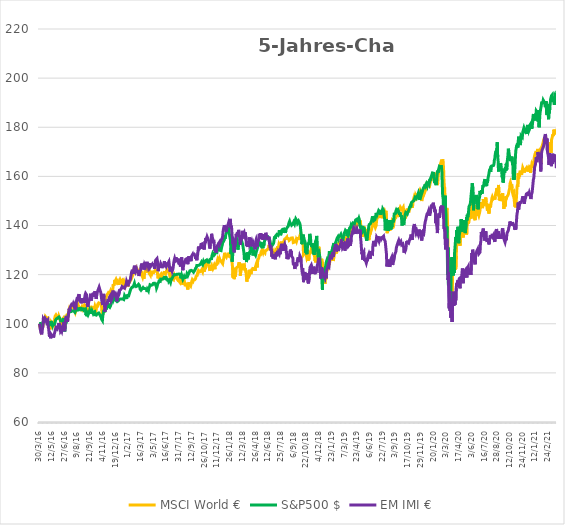
| Category | MSCI World € | S&P500 $ | EM IMI € |
|---|---|---|---|
| 2016-03-30 | 100 | 100 | 100 |
| 2016-03-31 | 99.311 | 99.762 | 99.573 |
| 2016-04-01 | 98.621 | 100.402 | 98.345 |
| 2016-04-04 | 98.814 | 100.085 | 98.345 |
| 2016-04-05 | 97.353 | 99.069 | 96.476 |
| 2016-04-06 | 97.932 | 100.148 | 96.369 |
| 2016-04-07 | 97.601 | 98.968 | 95.675 |
| 2016-04-08 | 98.153 | 99.238 | 97.01 |
| 2016-04-11 | 98.18 | 98.979 | 98.025 |
| 2016-04-12 | 98.952 | 99.942 | 98.879 |
| 2016-04-13 | 100.8 | 100.942 | 101.922 |
| 2016-04-14 | 101.958 | 100.931 | 102.029 |
| 2016-04-15 | 101.379 | 100.82 | 101.335 |
| 2016-04-18 | 101.544 | 101.55 | 101.281 |
| 2016-04-19 | 102.233 | 101.857 | 102.296 |
| 2016-04-20 | 102.923 | 101.942 | 101.975 |
| 2016-04-21 | 102.84 | 101.376 | 101.815 |
| 2016-04-22 | 102.812 | 101.402 | 101.548 |
| 2016-04-25 | 102.233 | 101.238 | 100.587 |
| 2016-04-26 | 102.261 | 101.386 | 100.641 |
| 2016-04-27 | 102.316 | 101.598 | 100.801 |
| 2016-04-28 | 102.399 | 100.683 | 101.335 |
| 2016-04-29 | 99.393 | 100.111 | 98.505 |
| 2016-05-02 | 99.724 | 100.91 | 98.025 |
| 2016-05-03 | 98.594 | 100.048 | 96.103 |
| 2016-05-04 | 98.098 | 99.46 | 94.768 |
| 2016-05-05 | 99.118 | 99.45 | 95.675 |
| 2016-05-06 | 97.767 | 99.81 | 94.981 |
| 2016-05-09 | 98.897 | 99.915 | 94.074 |
| 2016-05-10 | 100.193 | 101.153 | 95.675 |
| 2016-05-11 | 99.807 | 100.206 | 95.622 |
| 2016-05-12 | 99.393 | 100.265 | 95.195 |
| 2016-05-13 | 100.248 | 99.339 | 95.248 |
| 2016-05-17 | 100.386 | 100.328 | 95.035 |
| 2016-05-18 | 100.441 | 99.444 | 95.248 |
| 2016-05-19 | 99.504 | 99.429 | 94.394 |
| 2016-05-20 | 100.993 | 99.106 | 95.355 |
| 2016-05-23 | 100.524 | 99.725 | 95.195 |
| 2016-05-24 | 102.288 | 99.593 | 96.53 |
| 2016-05-25 | 103.171 | 100.857 | 97.277 |
| 2016-05-26 | 103.06 | 101.545 | 97.651 |
| 2016-05-27 | 103.667 | 101.593 | 98.398 |
| 2016-05-30 | 103.915 | 101.989 | 98.131 |
| 2016-05-31 | 103.557 | 101.868 | 98.078 |
| 2016-06-01 | 102.923 | 102.058 | 97.864 |
| 2016-06-02 | 103.06 | 102.365 | 98.452 |
| 2016-06-03 | 101.627 | 102.069 | 97.971 |
| 2016-06-06 | 102.288 | 102.561 | 99.359 |
| 2016-06-07 | 103.088 | 102.746 | 100.32 |
| 2016-06-08 | 102.647 | 103.084 | 100.374 |
| 2016-06-09 | 102.564 | 102.926 | 99.947 |
| 2016-06-10 | 101.765 | 101.936 | 98.452 |
| 2016-06-13 | 100.662 | 101.169 | 96.957 |
| 2016-06-14 | 99.917 | 100.947 | 96.583 |
| 2016-06-15 | 100.248 | 100.799 | 97.491 |
| 2016-06-16 | 100.138 | 101.127 | 97.064 |
| 2016-06-17 | 99.862 | 100.751 | 97.117 |
| 2016-06-20 | 101.792 | 101.397 | 98.986 |
| 2016-06-21 | 101.93 | 101.18 | 99.466 |
| 2016-06-22 | 102.261 | 101.011 | 100.107 |
| 2016-06-23 | 102.564 | 102.317 | 100.587 |
| 2016-06-24 | 100.496 | 98.704 | 98.292 |
| 2016-06-27 | 98.373 | 96.847 | 96.957 |
| 2016-06-28 | 99.063 | 98.635 | 99.092 |
| 2016-06-29 | 101.434 | 100.333 | 101.708 |
| 2016-06-30 | 102.399 | 101.688 | 102.349 |
| 2016-07-01 | 102.867 | 101.899 | 103.15 |
| 2016-07-04 | 102.895 | 101.185 | 102.883 |
| 2016-07-05 | 102.095 | 101.783 | 101.442 |
| 2016-07-06 | 101.875 | 101.714 | 100.801 |
| 2016-07-07 | 102.702 | 103.259 | 102.029 |
| 2016-07-08 | 102.812 | 103.619 | 103.257 |
| 2016-07-11 | 105.156 | 104.349 | 104.805 |
| 2016-07-12 | 105.817 | 104.312 | 106.14 |
| 2016-07-13 | 105.266 | 104.92 | 104.912 |
| 2016-07-14 | 106.093 | 104.762 | 106.46 |
| 2016-07-15 | 105.542 | 105.063 | 106.887 |
| 2016-07-18 | 106.341 | 104.947 | 107.048 |
| 2016-07-19 | 106.424 | 105.37 | 107.048 |
| 2016-07-20 | 107.306 | 104.973 | 107.902 |
| 2016-07-21 | 107.058 | 105.46 | 107.581 |
| 2016-07-22 | 107.224 | 105.206 | 107.742 |
| 2016-07-25 | 107.058 | 105.201 | 107.528 |
| 2016-07-26 | 107.113 | 105.132 | 108.062 |
| 2016-07-27 | 107.251 | 105.248 | 108.062 |
| 2016-07-28 | 106.038 | 105.434 | 107.048 |
| 2016-07-29 | 106.396 | 105.312 | 107.475 |
| 2016-08-01 | 106.203 | 104.656 | 107.742 |
| 2016-08-02 | 104.604 | 104.957 | 105.82 |
| 2016-08-03 | 105.128 | 105.058 | 106.193 |
| 2016-08-04 | 105.983 | 105.904 | 107.742 |
| 2016-08-05 | 107.224 | 105.852 | 109.343 |
| 2016-08-08 | 107.389 | 105.92 | 110.144 |
| 2016-08-09 | 107.637 | 105.65 | 110.785 |
| 2016-08-10 | 106.782 | 106.169 | 109.557 |
| 2016-08-11 | 107.554 | 106.063 | 111.052 |
| 2016-08-12 | 107.389 | 106.37 | 110.892 |
| 2016-08-15 | 107.527 | 105.82 | 112.066 |
| 2016-08-16 | 106.259 | 105.994 | 110.304 |
| 2016-08-17 | 105.79 | 106.248 | 109.076 |
| 2016-08-18 | 106.066 | 106.1 | 110.144 |
| 2016-08-19 | 105.762 | 106.09 | 109.237 |
| 2016-08-22 | 105.707 | 106.285 | 108.329 |
| 2016-08-23 | 106.369 | 105.772 | 109.183 |
| 2016-08-24 | 106.782 | 105.688 | 108.596 |
| 2016-08-25 | 106.231 | 105.486 | 108.436 |
| 2016-08-26 | 106.672 | 106.021 | 110.358 |
| 2016-08-29 | 106.948 | 105.82 | 109.237 |
| 2016-08-30 | 107.058 | 105.561 | 109.824 |
| 2016-08-31 | 106.617 | 105.539 | 108.97 |
| 2016-09-01 | 107.224 | 106.01 | 108.489 |
| 2016-09-02 | 106.617 | 106.344 | 110.678 |
| 2016-09-05 | 107.885 | 106.338 | 111.906 |
| 2016-09-06 | 107.334 | 106.09 | 112.387 |
| 2016-09-07 | 107.499 | 103.529 | 112.066 |
| 2016-09-08 | 107.168 | 105.01 | 111.906 |
| 2016-09-09 | 106.231 | 103.053 | 109.717 |
| 2016-09-12 | 105.211 | 102.989 | 107.902 |
| 2016-09-13 | 104.163 | 104.047 | 106.834 |
| 2016-09-14 | 104.218 | 103.64 | 106.887 |
| 2016-09-15 | 105.045 | 103.672 | 108.489 |
| 2016-09-16 | 105.018 | 103.682 | 108.169 |
| 2016-09-19 | 105.845 | 104.846 | 109.717 |
| 2016-09-20 | 105.707 | 105.476 | 109.61 |
| 2016-09-21 | 106.589 | 104.91 | 110.945 |
| 2016-09-22 | 107.279 | 104.074 | 112.226 |
| 2016-09-23 | 107.058 | 104.709 | 112.013 |
| 2016-09-26 | 105.459 | 105.275 | 109.45 |
| 2016-09-27 | 106.286 | 104.285 | 110.518 |
| 2016-09-28 | 106.396 | 105.121 | 111.212 |
| 2016-09-29 | 106.589 | 104.788 | 110.998 |
| 2016-09-30 | 106.341 | 104.301 | 110.945 |
| 2016-10-04 | 107.251 | 104.735 | 112.6 |
| 2016-10-05 | 106.727 | 104.857 | 111.052 |
| 2016-10-06 | 106.534 | 104.471 | 111.959 |
| 2016-10-07 | 106.286 | 104.952 | 111.959 |
| 2016-10-10 | 107.141 | 103.677 | 113.241 |
| 2016-10-11 | 106.672 | 103.809 | 111.372 |
| 2016-10-12 | 106.948 | 103.476 | 111.799 |
| 2016-10-13 | 105.983 | 103.502 | 110.091 |
| 2016-10-14 | 107.141 | 103.196 | 111.479 |
| 2016-10-17 | 106.645 | 103.804 | 111.265 |
| 2016-10-18 | 107.554 | 104.09 | 113.081 |
| 2016-10-19 | 108.051 | 103.92 | 113.241 |
| 2016-10-20 | 108.051 | 103.947 | 113.988 |
| 2016-10-21 | 108.492 | 104.37 | 114.362 |
| 2016-10-24 | 108.85 | 104.074 | 114.896 |
| 2016-10-25 | 108.575 | 103.841 | 115.216 |
| 2016-10-26 | 108.271 | 103.566 | 113.721 |
| 2016-10-27 | 108.133 | 103.238 | 113.187 |
| 2016-10-28 | 107.83 | 103.238 | 112.76 |
| 2016-10-31 | 107.279 | 102.518 | 112.707 |
| 2016-11-01 | 106.782 | 101.841 | 112.493 |
| 2016-11-02 | 104.522 | 101.444 | 108.809 |
| 2016-11-03 | 104.411 | 101.307 | 108.809 |
| 2016-11-04 | 103.998 | 103.529 | 107.635 |
| 2016-11-07 | 105.321 | 104.005 | 111.265 |
| 2016-11-08 | 106.369 | 105.116 | 112.173 |
| 2016-11-09 | 104.659 | 105.36 | 110.678 |
| 2016-11-10 | 108.519 | 105.164 | 107.955 |
| 2016-11-11 | 108.575 | 105.18 | 104.859 |
| 2016-11-14 | 109.733 | 106.031 | 105.873 |
| 2016-11-15 | 110.063 | 105.852 | 107.314 |
| 2016-11-16 | 110.67 | 106.354 | 107.314 |
| 2016-11-17 | 111.277 | 106.164 | 108.542 |
| 2016-11-18 | 111.414 | 106.947 | 107.902 |
| 2016-11-21 | 111.938 | 107.142 | 108.703 |
| 2016-11-22 | 112.076 | 107.238 | 109.557 |
| 2016-11-23 | 112.242 | 107.666 | 109.503 |
| 2016-11-24 | 112.793 | 107.158 | 109.61 |
| 2016-11-25 | 112.793 | 107.328 | 109.503 |
| 2016-11-28 | 112.71 | 107.084 | 110.785 |
| 2016-11-29 | 112.628 | 106.666 | 110.678 |
| 2016-11-30 | 113.041 | 106.74 | 111.319 |
| 2016-12-01 | 112.131 | 107.354 | 109.984 |
| 2016-12-02 | 111.552 | 107.73 | 109.343 |
| 2016-12-05 | 111.69 | 109.095 | 109.183 |
| 2016-12-06 | 111.8 | 109.38 | 109.397 |
| 2016-12-07 | 112.49 | 110.047 | 110.464 |
| 2016-12-08 | 113.151 | 109.925 | 112.6 |
| 2016-12-09 | 115.688 | 110.677 | 113.508 |
| 2016-12-12 | 115.688 | 109.761 | 112.173 |
| 2016-12-13 | 115.936 | 110.169 | 112.493 |
| 2016-12-14 | 115.908 | 109.978 | 111.799 |
| 2016-12-15 | 117.894 | 110.227 | 112.387 |
| 2016-12-16 | 117.259 | 110.65 | 111.746 |
| 2016-12-19 | 117.315 | 110.349 | 111.319 |
| 2016-12-20 | 117.976 | 109.523 | 111.799 |
| 2016-12-21 | 117.618 | 109.619 | 111.319 |
| 2016-12-22 | 116.929 | 109.888 | 109.13 |
| 2016-12-23 | 117.039 | 109.021 | 109.824 |
| 2016-12-27 | 117.37 | 109 | 110.571 |
| 2016-12-28 | 117.728 | 108.624 | 111.799 |
| 2016-12-29 | 116.405 | 109.38 | 112.333 |
| 2016-12-30 | 115.826 | 110.026 | 111.853 |
| 2017-01-02 | 117.122 | 109.941 | 112.28 |
| 2017-01-03 | 117.508 | 110.37 | 113.561 |
| 2017-01-04 | 117.949 | 110.021 | 113.828 |
| 2017-01-05 | 117.783 | 110.005 | 113.721 |
| 2017-01-06 | 117.122 | 110.317 | 114.042 |
| 2017-01-09 | 117.37 | 110.074 | 113.775 |
| 2017-01-10 | 117.425 | 110.29 | 114.682 |
| 2017-01-11 | 117.645 | 109.899 | 115.163 |
| 2017-01-12 | 116.736 | 110.132 | 114.842 |
| 2017-01-13 | 116.901 | 109.761 | 115.43 |
| 2017-01-16 | 117.259 | 110.116 | 114.789 |
| 2017-01-17 | 116.046 | 109.862 | 114.415 |
| 2017-01-18 | 116.35 | 110.56 | 114.789 |
| 2017-01-19 | 116.68 | 111.481 | 114.469 |
| 2017-01-20 | 116.487 | 111.396 | 114.095 |
| 2017-01-23 | 115.412 | 111.238 | 114.629 |
| 2017-01-24 | 115.881 | 110.566 | 115.804 |
| 2017-01-25 | 116.625 | 110.56 | 116.231 |
| 2017-01-26 | 117.645 | 110.576 | 117.298 |
| 2017-01-27 | 117.508 | 110.624 | 116.871 |
| 2017-01-30 | 116.405 | 111.444 | 116.818 |
| 2017-01-31 | 115.164 | 111.211 | 115.27 |
| 2017-02-01 | 116.101 | 111.238 | 116.177 |
| 2017-02-02 | 115.881 | 111.38 | 116.124 |
| 2017-02-03 | 116.68 | 112.015 | 116.658 |
| 2017-02-06 | 116.763 | 112.465 | 117.512 |
| 2017-02-07 | 117.259 | 113.063 | 117.779 |
| 2017-02-08 | 117.287 | 113.534 | 117.939 |
| 2017-02-09 | 117.728 | 114.11 | 119.114 |
| 2017-02-10 | 118.886 | 114.02 | 119.915 |
| 2017-02-13 | 119.327 | 114.195 | 120.982 |
| 2017-02-14 | 120.072 | 114.867 | 120.822 |
| 2017-02-15 | 120.568 | 114.814 | 121.997 |
| 2017-02-16 | 119.824 | 114.878 | 121.036 |
| 2017-02-17 | 120.265 | 115.015 | 120.342 |
| 2017-02-20 | 120.761 | 115.184 | 121.57 |
| 2017-02-21 | 121.643 | 114.846 | 122.851 |
| 2017-02-22 | 121.836 | 116.475 | 123.652 |
| 2017-02-23 | 121.809 | 115.793 | 123.438 |
| 2017-02-24 | 121.092 | 115.856 | 121.783 |
| 2017-02-27 | 121.147 | 115.497 | 121.249 |
| 2017-02-28 | 120.926 | 115.147 | 121.41 |
| 2017-03-01 | 122.719 | 114.904 | 122.157 |
| 2017-03-02 | 122.746 | 115.026 | 121.249 |
| 2017-03-03 | 122.14 | 115.428 | 120.929 |
| 2017-03-06 | 121.533 | 115.497 | 120.876 |
| 2017-03-07 | 121.45 | 115.105 | 121.356 |
| 2017-03-08 | 121.698 | 116.063 | 121.143 |
| 2017-03-09 | 121.147 | 115.867 | 119.434 |
| 2017-03-10 | 121.478 | 115.634 | 119.274 |
| 2017-03-13 | 121.037 | 115.514 | 121.036 |
| 2017-03-14 | 120.816 | 114.057 | 120.982 |
| 2017-03-15 | 121.588 | 113.761 | 121.783 |
| 2017-03-16 | 121.23 | 113.645 | 123.438 |
| 2017-03-17 | 121.23 | 113.608 | 123.438 |
| 2017-03-20 | 120.982 | 113.423 | 124.506 |
| 2017-03-21 | 119.382 | 114.264 | 122.691 |
| 2017-03-22 | 118.941 | 114.433 | 123.011 |
| 2017-03-23 | 119.603 | 114.74 | 123.492 |
| 2017-03-24 | 119.603 | 114.465 | 123.438 |
| 2017-03-27 | 118.335 | 114.322 | 122.05 |
| 2017-03-28 | 119.327 | 114.385 | 122.798 |
| 2017-03-29 | 120.651 | 114.036 | 124.026 |
| 2017-03-30 | 121.368 | 114.333 | 124.293 |
| 2017-03-31 | 121.23 | 114.232 | 123.332 |
| 2017-04-03 | 121.037 | 114.311 | 124.346 |
| 2017-04-04 | 121.312 | 114.169 | 124.773 |
| 2017-04-05 | 121.781 | 113.698 | 125.093 |
| 2017-04-06 | 120.982 | 112.941 | 124.453 |
| 2017-04-07 | 121.781 | 113.93 | 124.773 |
| 2017-04-10 | 122.112 | 113.618 | 124.346 |
| 2017-04-11 | 121.202 | 113.37 | 123.278 |
| 2017-04-12 | 121.864 | 114.296 | 123.705 |
| 2017-04-13 | 121.257 | 113.962 | 124.72 |
| 2017-04-18 | 120.485 | 115.179 | 122.691 |
| 2017-04-19 | 120.32 | 115.872 | 122.424 |
| 2017-04-20 | 119.851 | 115.788 | 122.424 |
| 2017-04-21 | 120.954 | 115.877 | 123.438 |
| 2017-04-24 | 120.789 | 115.655 | 123.065 |
| 2017-04-25 | 120.54 | 115.936 | 123.385 |
| 2017-04-26 | 121.561 | 115.973 | 124.132 |
| 2017-04-27 | 120.982 | 115.856 | 123.492 |
| 2017-04-28 | 120.761 | 115.962 | 123.278 |
| 2017-05-02 | 121.092 | 116.428 | 124.72 |
| 2017-05-03 | 120.816 | 116.433 | 124.079 |
| 2017-05-04 | 120.926 | 116.285 | 123.705 |
| 2017-05-05 | 120.844 | 116.502 | 122.371 |
| 2017-05-08 | 121.561 | 116.264 | 123.705 |
| 2017-05-09 | 122.084 | 116.084 | 125.521 |
| 2017-05-10 | 122.002 | 116.671 | 125.948 |
| 2017-05-11 | 121.781 | 116.65 | 126.161 |
| 2017-05-12 | 121.643 | 114.581 | 126.268 |
| 2017-05-15 | 121.643 | 114.999 | 126.535 |
| 2017-05-16 | 120.844 | 115.713 | 125.574 |
| 2017-05-17 | 118.886 | 116.359 | 123.705 |
| 2017-05-18 | 118.859 | 116.586 | 121.41 |
| 2017-05-19 | 118.748 | 116.867 | 122.851 |
| 2017-05-22 | 118.831 | 117.412 | 122.637 |
| 2017-05-23 | 119.382 | 117.417 | 122.637 |
| 2017-05-24 | 119.768 | 117.306 | 123.385 |
| 2017-05-25 | 119.879 | 117.28 | 123.759 |
| 2017-05-26 | 119.631 | 118.195 | 124.56 |
| 2017-05-29 | 120.292 | 118.565 | 124.453 |
| 2017-05-30 | 120.099 | 118.486 | 123.865 |
| 2017-05-31 | 119.41 | 118.147 | 122.637 |
| 2017-06-01 | 120.265 | 118.343 | 123.545 |
| 2017-06-02 | 120.485 | 118.385 | 123.919 |
| 2017-06-06 | 120.292 | 118.248 | 123.759 |
| 2017-06-07 | 120.347 | 118.2 | 123.545 |
| 2017-06-08 | 120.761 | 118.777 | 124.826 |
| 2017-06-09 | 121.423 | 118.65 | 125.467 |
| 2017-06-12 | 120.292 | 118.412 | 123.652 |
| 2017-06-13 | 121.009 | 118.443 | 124.079 |
| 2017-06-14 | 120.347 | 119.412 | 124.026 |
| 2017-06-15 | 120.871 | 118.629 | 123.438 |
| 2017-06-16 | 120.733 | 118.581 | 123.545 |
| 2017-06-19 | 121.974 | 118.512 | 124.933 |
| 2017-06-20 | 121.864 | 118.179 | 124.079 |
| 2017-06-21 | 121.312 | 118.216 | 124.079 |
| 2017-06-22 | 121.395 | 117.274 | 124.666 |
| 2017-06-23 | 120.982 | 118.311 | 124.506 |
| 2017-06-26 | 121.064 | 117.29 | 125.307 |
| 2017-06-27 | 120.347 | 117.486 | 123.919 |
| 2017-06-28 | 119.658 | 117.745 | 122.21 |
| 2017-06-29 | 119.465 | 117.951 | 121.249 |
| 2017-06-30 | 118.28 | 116.893 | 122.21 |
| 2017-07-03 | 119.355 | 117.634 | 123.171 |
| 2017-07-04 | 119.079 | 117.756 | 122.637 |
| 2017-07-05 | 119.245 | 117.666 | 122.691 |
| 2017-07-06 | 118.28 | 118.549 | 121.41 |
| 2017-07-07 | 118.307 | 118.75 | 121.249 |
| 2017-07-10 | 118.61 | 119.29 | 122.424 |
| 2017-07-11 | 117.921 | 119.306 | 122.477 |
| 2017-07-12 | 119.327 | 119.396 | 125.093 |
| 2017-07-13 | 119.824 | 120.025 | 126.001 |
| 2017-07-14 | 119.52 | 120.062 | 126.588 |
| 2017-07-17 | 119.741 | 119.978 | 126.375 |
| 2017-07-18 | 118.528 | 119.935 | 125.414 |
| 2017-07-19 | 119.658 | 120.221 | 127.122 |
| 2017-07-20 | 118.666 | 120.258 | 125.574 |
| 2017-07-21 | 118.28 | 120.115 | 125.307 |
| 2017-07-24 | 118.197 | 119.978 | 125.788 |
| 2017-07-25 | 118.666 | 119.909 | 125.788 |
| 2017-07-26 | 118.914 | 120.179 | 126.054 |
| 2017-07-27 | 118.776 | 120.248 | 126.535 |
| 2017-07-28 | 117.48 | 120.036 | 124.56 |
| 2017-07-31 | 117.315 | 120.237 | 124.453 |
| 2017-08-01 | 117.535 | 120.433 | 124.826 |
| 2017-08-02 | 116.791 | 120.195 | 124.132 |
| 2017-08-03 | 116.708 | 120.126 | 123.278 |
| 2017-08-04 | 118.087 | 118.475 | 125.147 |
| 2017-08-07 | 117.728 | 118.634 | 125.574 |
| 2017-08-08 | 118.5 | 119.798 | 127.069 |
| 2017-08-09 | 117.618 | 119.808 | 124.987 |
| 2017-08-10 | 116.763 | 119.999 | 123.225 |
| 2017-08-11 | 115.798 | 118.131 | 121.783 |
| 2017-08-14 | 116.984 | 117.914 | 123.812 |
| 2017-08-15 | 117.37 | 118.057 | 124.026 |
| 2017-08-16 | 117.921 | 119.253 | 125.36 |
| 2017-08-17 | 117.011 | 118.846 | 124.826 |
| 2017-08-18 | 116.184 | 118.57 | 124.933 |
| 2017-08-21 | 115.274 | 118.83 | 124.506 |
| 2017-08-22 | 116.598 | 118.872 | 126.268 |
| 2017-08-23 | 116.129 | 118.962 | 125.948 |
| 2017-08-24 | 115.881 | 119.555 | 126.268 |
| 2017-08-25 | 115.66 | 120.258 | 126.535 |
| 2017-08-28 | 114.723 | 120.465 | 125.414 |
| 2017-08-29 | 113.923 | 119.576 | 124.239 |
| 2017-08-30 | 115.274 | 119.994 | 125.734 |
| 2017-08-31 | 116.35 | 119.967 | 126.482 |
| 2017-09-01 | 116.901 | 119.782 | 127.496 |
| 2017-09-04 | 116.046 | 121.089 | 126.001 |
| 2017-09-05 | 116.019 | 121.533 | 126.054 |
| 2017-09-06 | 115.798 | 121.607 | 125.734 |
| 2017-09-07 | 115.385 | 121.565 | 126.001 |
| 2017-09-08 | 115.55 | 121.734 | 125.467 |
| 2017-09-11 | 116.818 | 121.946 | 127.443 |
| 2017-09-12 | 117.397 | 122.094 | 127.763 |
| 2017-09-13 | 117.894 | 121.539 | 127.71 |
| 2017-09-14 | 118.087 | 121.195 | 128.297 |
| 2017-09-15 | 117.37 | 121.179 | 127.763 |
| 2017-09-18 | 117.838 | 120.999 | 128.831 |
| 2017-09-19 | 117.811 | 121.041 | 128.297 |
| 2017-09-20 | 117.618 | 121.512 | 128.35 |
| 2017-09-21 | 117.921 | 121.655 | 128.457 |
| 2017-09-22 | 117.701 | 122.089 | 127.389 |
| 2017-09-25 | 118.417 | 122.602 | 126.428 |
| 2017-09-26 | 119.217 | 122.851 | 126.962 |
| 2017-09-27 | 119.548 | 123.02 | 126.268 |
| 2017-09-28 | 119.575 | 123.75 | 125.841 |
| 2017-09-29 | 119.686 | 123.634 | 126.962 |
| 2017-10-02 | 120.789 | 123.417 | 128.137 |
| 2017-10-04 | 120.982 | 123.729 | 129.685 |
| 2017-10-05 | 121.671 | 123.93 | 131.447 |
| 2017-10-06 | 121.395 | 123.739 | 130.272 |
| 2017-10-09 | 121.478 | 123.877 | 129.952 |
| 2017-10-10 | 121.092 | 124.073 | 130.699 |
| 2017-10-11 | 120.899 | 124.152 | 130.699 |
| 2017-10-12 | 121.009 | 124.263 | 131.34 |
| 2017-10-13 | 121.423 | 124.327 | 132.301 |
| 2017-10-16 | 121.698 | 124.946 | 132.675 |
| 2017-10-17 | 122.002 | 124.491 | 132.194 |
| 2017-10-18 | 122.14 | 124.665 | 132.515 |
| 2017-10-19 | 121.257 | 124.068 | 130.486 |
| 2017-10-20 | 122.277 | 124.184 | 131.874 |
| 2017-10-23 | 122.719 | 125.242 | 131.393 |
| 2017-10-24 | 122.36 | 124.787 | 131.5 |
| 2017-10-25 | 121.147 | 124.93 | 130.219 |
| 2017-10-26 | 122.719 | 125.147 | 131.927 |
| 2017-10-27 | 124.318 | 125.2 | 133.582 |
| 2017-10-30 | 123.766 | 125.618 | 132.835 |
| 2017-11-01 | 124.428 | 125.808 | 134.917 |
| 2017-11-02 | 123.959 | 125.755 | 134.116 |
| 2017-11-03 | 124.731 | 125.94 | 134.33 |
| 2017-11-06 | 124.924 | 125.485 | 135.398 |
| 2017-11-07 | 125.172 | 125.411 | 135.344 |
| 2017-11-08 | 125.062 | 125.559 | 135.451 |
| 2017-11-09 | 123.987 | 125.253 | 134.116 |
| 2017-11-10 | 123.739 | 124.612 | 133.636 |
| 2017-11-13 | 123.573 | 125.676 | 133.476 |
| 2017-11-14 | 122.167 | 125.337 | 131.5 |
| 2017-11-15 | 121.533 | 125.501 | 130.593 |
| 2017-11-16 | 122.608 | 126.337 | 132.835 |
| 2017-11-17 | 122.222 | 126.247 | 133.529 |
| 2017-11-20 | 122.884 | 126.512 | 134.544 |
| 2017-11-21 | 123.739 | 126.475 | 136.626 |
| 2017-11-22 | 123.187 | 127.729 | 135.718 |
| 2017-11-23 | 122.829 | 127.681 | 135.077 |
| 2017-11-24 | 122.36 | 128.75 | 134.33 |
| 2017-11-27 | 122.222 | 128.512 | 132.835 |
| 2017-11-28 | 123.104 | 128.374 | 134.17 |
| 2017-11-29 | 123.573 | 127.919 | 132.782 |
| 2017-11-30 | 123.518 | 127.914 | 131.18 |
| 2017-12-01 | 122.195 | 128.337 | 129.632 |
| 2017-12-04 | 124.304 | 129.036 | 131.18 |
| 2017-12-05 | 124.29 | 129.453 | 131.66 |
| 2017-12-06 | 124.014 | 129.676 | 128.991 |
| 2017-12-07 | 124.194 | 129.644 | 129.792 |
| 2017-12-08 | 124.979 | 129.131 | 131.18 |
| 2017-12-11 | 124.966 | 130.215 | 131.66 |
| 2017-12-12 | 126.234 | 131.025 | 131.34 |
| 2017-12-13 | 125.931 | 130.549 | 132.381 |
| 2017-12-14 | 125.462 | 130.448 | 132.168 |
| 2017-12-15 | 125.806 | 130.713 | 132.248 |
| 2017-12-18 | 126.523 | 130.686 | 133.209 |
| 2017-12-19 | 126.027 | 129.908 | 132.461 |
| 2017-12-20 | 125.172 | 129.983 | 132.194 |
| 2017-12-21 | 125.696 | 130.226 | 132.835 |
| 2017-12-22 | 125.724 | 129.776 | 133.743 |
| 2017-12-27 | 125.531 | 130.729 | 133.956 |
| 2017-12-28 | 124.952 | 131.506 | 134.437 |
| 2017-12-29 | 125.255 | 132.083 | 134.704 |
| 2018-01-02 | 124.464 | 132.929 | 135.611 |
| 2018-01-03 | 125.476 | 133.205 | 137.672 |
| 2018-01-04 | 126.129 | 133.485 | 137.934 |
| 2018-01-05 | 127.028 | 133.257 | 139.386 |
| 2018-01-08 | 127.957 | 134.242 | 140.139 |
| 2018-01-09 | 128.886 | 135.13 | 140.438 |
| 2018-01-10 | 128.114 | 134.638 | 139.034 |
| 2018-01-11 | 127.684 | 135.94 | 138.596 |
| 2018-01-12 | 127.91 | 135.755 | 139.119 |
| 2018-01-15 | 127.168 | 136.331 | 137.437 |
| 2018-01-16 | 127.64 | 137.427 | 138.879 |
| 2018-01-17 | 127.469 | 137.739 | 139.322 |
| 2018-01-18 | 127.491 | 137.67 | 139.423 |
| 2018-01-19 | 127.968 | 137.733 | 140.352 |
| 2018-01-22 | 128.293 | 139.337 | 140.945 |
| 2018-01-23 | 128.908 | 138.374 | 141.5 |
| 2018-01-24 | 127.822 | 136.898 | 141.009 |
| 2018-01-25 | 126.992 | 137.024 | 141.207 |
| 2018-01-26 | 128.031 | 136.887 | 142.67 |
| 2018-01-29 | 128.583 | 133.956 | 142.034 |
| 2018-01-30 | 126.989 | 128.454 | 139.253 |
| 2018-01-31 | 126.465 | 130.829 | 139.936 |
| 2018-02-01 | 126.01 | 130.115 | 138.462 |
| 2018-02-02 | 124.731 | 125.279 | 135.771 |
| 2018-02-05 | 122.989 | 127.21 | 135.093 |
| 2018-02-06 | 118.773 | 128.956 | 132.44 |
| 2018-02-07 | 122.782 | 129.39 | 134.645 |
| 2018-02-08 | 120.386 | 131.083 | 130.518 |
| 2018-02-09 | 118.147 | 132.781 | 129.06 |
| 2018-02-12 | 119.868 | 132.765 | 131.143 |
| 2018-02-13 | 119.098 | 131.961 | 131.292 |
| 2018-02-14 | 119.912 | 131.268 | 132.76 |
| 2018-02-15 | 120.598 | 131.427 | 134.992 |
| 2018-02-16 | 122.586 | 133.586 | 136.599 |
| 2018-02-19 | 122.374 | 135.125 | 135.521 |
| 2018-02-20 | 123.027 | 133.4 | 135.398 |
| 2018-02-21 | 123.397 | 131.919 | 137.256 |
| 2018-02-22 | 122.892 | 130.178 | 136.375 |
| 2018-02-23 | 123.229 | 130.871 | 137.395 |
| 2018-02-26 | 124.455 | 132.374 | 138.227 |
| 2018-02-27 | 125.023 | 132.707 | 136.877 |
| 2018-02-28 | 124.216 | 132.649 | 135.665 |
| 2018-03-01 | 122.752 | 133.268 | 135.969 |
| 2018-03-02 | 119.564 | 135.575 | 132.088 |
| 2018-03-05 | 121.277 | 135.443 | 133.588 |
| 2018-03-06 | 121.241 | 134.548 | 133.951 |
| 2018-03-07 | 121.373 | 133.839 | 133.716 |
| 2018-03-08 | 122.594 | 133.713 | 134.907 |
| 2018-03-09 | 123.945 | 133.85 | 137.064 |
| 2018-03-12 | 124.461 | 132.062 | 137.832 |
| 2018-03-13 | 123.322 | 132.295 | 136.551 |
| 2018-03-14 | 122.956 | 131.988 | 136.487 |
| 2018-03-15 | 123.548 | 128.707 | 137.133 |
| 2018-03-16 | 123.821 | 125.967 | 137.112 |
| 2018-03-19 | 121.704 | 128.845 | 134.672 |
| 2018-03-20 | 122.564 | 126.612 | 137.202 |
| 2018-03-21 | 122.887 | 126.258 | 137.165 |
| 2018-03-22 | 120.888 | 128.078 | 134.127 |
| 2018-03-23 | 118.547 | 125.115 | 131.618 |
| 2018-03-26 | 117.152 | 126.702 | 131.5 |
| 2018-03-27 | 119.449 | 128.163 | 133.369 |
| 2018-03-28 | 118.437 | 129.088 | 131.233 |
| 2018-03-29 | 119.666 | 126.247 | 133.545 |
| 2018-04-03 | 118.66 | 126.76 | 132.952 |
| 2018-04-04 | 118.583 | 128.85 | 131.847 |
| 2018-04-05 | 121.944 | 128.168 | 135.163 |
| 2018-04-06 | 120.226 | 129.242 | 132.296 |
| 2018-04-09 | 120.416 | 128.882 | 132.536 |
| 2018-04-10 | 120.913 | 129.93 | 132.942 |
| 2018-04-11 | 120.237 | 131.326 | 132.771 |
| 2018-04-12 | 121.318 | 131.4 | 133.684 |
| 2018-04-13 | 121.252 | 130.681 | 132.75 |
| 2018-04-16 | 121.045 | 129.623 | 131.49 |
| 2018-04-17 | 122.465 | 129.565 | 132.627 |
| 2018-04-18 | 122.691 | 127.797 | 133.187 |
| 2018-04-19 | 122.291 | 128.125 | 133.059 |
| 2018-04-20 | 122.283 | 129.443 | 132.242 |
| 2018-04-23 | 122.931 | 129.58 | 132.579 |
| 2018-04-24 | 122.641 | 128.522 | 132.205 |
| 2018-04-25 | 121.569 | 128.797 | 130.31 |
| 2018-04-26 | 123.317 | 127.919 | 132.509 |
| 2018-04-27 | 123.81 | 127.618 | 133.865 |
| 2018-04-30 | 124.34 | 129.311 | 134.463 |
| 2018-05-02 | 124.486 | 129.713 | 133.914 |
| 2018-05-03 | 122.942 | 129.707 | 131.308 |
| 2018-05-04 | 125.04 | 130.967 | 133.337 |
| 2018-05-07 | 126.071 | 132.194 | 133.46 |
| 2018-05-08 | 126.289 | 132.517 | 133.668 |
| 2018-05-09 | 126.752 | 132.665 | 134.036 |
| 2018-05-10 | 127.797 | 131.755 | 136.658 |
| 2018-05-11 | 127.885 | 132.316 | 136.06 |
| 2018-05-14 | 127.998 | 132.205 | 136.321 |
| 2018-05-15 | 127.993 | 131.877 | 134.554 |
| 2018-05-16 | 128.845 | 132.845 | 136.781 |
| 2018-05-17 | 129.443 | 132.464 | 135.622 |
| 2018-05-18 | 129.234 | 132.877 | 134.474 |
| 2018-05-22 | 130.014 | 132.623 | 135.873 |
| 2018-05-23 | 129.421 | 132.289 | 135.174 |
| 2018-05-24 | 129.007 | 130.76 | 134.148 |
| 2018-05-25 | 129.744 | 132.485 | 136.503 |
| 2018-05-28 | 129.92 | 131.628 | 136.658 |
| 2018-05-29 | 129.291 | 133.014 | 135.451 |
| 2018-05-30 | 129.402 | 133.601 | 134.405 |
| 2018-05-31 | 128.87 | 133.787 | 134.394 |
| 2018-06-01 | 129.73 | 134.855 | 136.012 |
| 2018-06-04 | 129.992 | 134.792 | 137.032 |
| 2018-06-05 | 130.047 | 135.215 | 136.562 |
| 2018-06-06 | 129.975 | 135.39 | 136.684 |
| 2018-06-07 | 129.774 | 135.617 | 135.398 |
| 2018-06-08 | 130.006 | 135.078 | 134.64 |
| 2018-06-11 | 130.411 | 135.469 | 134.784 |
| 2018-06-12 | 130.535 | 135.353 | 134.837 |
| 2018-06-13 | 130.838 | 135.03 | 134.837 |
| 2018-06-14 | 132.14 | 134.517 | 135.451 |
| 2018-06-15 | 131.221 | 134.76 | 132.867 |
| 2018-06-18 | 131.219 | 133.919 | 131.58 |
| 2018-06-19 | 130.642 | 134.157 | 130.796 |
| 2018-06-20 | 131.202 | 132.3 | 131.837 |
| 2018-06-21 | 130.331 | 132.591 | 129.792 |
| 2018-06-22 | 130.713 | 131.49 | 130.459 |
| 2018-06-25 | 127.659 | 131.676 | 127.181 |
| 2018-06-26 | 128.246 | 132.009 | 127.656 |
| 2018-06-27 | 129.512 | 132.162 | 127.381 |
| 2018-06-28 | 128.704 | 131.628 | 126.503 |
| 2018-06-29 | 129.14 | 132.755 | 128.286 |
| 2018-07-02 | 128.266 | 133.861 | 127.01 |
| 2018-07-03 | 128.835 | 135.046 | 127.774 |
| 2018-07-04 | 128.635 | 135.517 | 126.839 |
| 2018-07-05 | 128.547 | 134.591 | 126.236 |
| 2018-07-06 | 129.159 | 135.744 | 127.336 |
| 2018-07-09 | 130.181 | 135.861 | 129.026 |
| 2018-07-10 | 130.844 | 135.776 | 128.986 |
| 2018-07-11 | 129.821 | 136.358 | 127.453 |
| 2018-07-12 | 130.791 | 136.607 | 129.151 |
| 2018-07-13 | 131.512 | 136.088 | 129.669 |
| 2018-07-16 | 130.907 | 135.961 | 128.057 |
| 2018-07-17 | 131.359 | 136.22 | 129.13 |
| 2018-07-18 | 132.247 | 136.86 | 129.306 |
| 2018-07-19 | 132.341 | 138.114 | 128.446 |
| 2018-07-20 | 131.492 | 137.707 | 129.258 |
| 2018-07-23 | 131.288 | 136.813 | 128.329 |
| 2018-07-24 | 132.233 | 136.025 | 130.646 |
| 2018-07-25 | 132.459 | 136.712 | 131.399 |
| 2018-07-26 | 133.455 | 136.543 | 131.981 |
| 2018-07-27 | 133.488 | 137.236 | 132.568 |
| 2018-07-30 | 132.004 | 137.908 | 131.345 |
| 2018-07-31 | 132.333 | 138.427 | 131.522 |
| 2018-08-01 | 132.396 | 138.813 | 131.484 |
| 2018-08-02 | 132.451 | 138.739 | 129.685 |
| 2018-08-03 | 133.322 | 138.564 | 131.404 |
| 2018-08-06 | 134.017 | 137.622 | 131.116 |
| 2018-08-07 | 134.458 | 137.104 | 132.338 |
| 2018-08-08 | 134.323 | 137.987 | 131.522 |
| 2018-08-09 | 134.571 | 136.972 | 132.066 |
| 2018-08-10 | 134.828 | 138.083 | 130.721 |
| 2018-08-13 | 134.524 | 138.543 | 128.809 |
| 2018-08-14 | 135.241 | 138.85 | 129.546 |
| 2018-08-15 | 134.108 | 139.151 | 126.38 |
| 2018-08-16 | 134.792 | 139.109 | 127.544 |
| 2018-08-17 | 134.444 | 138.908 | 126.295 |
| 2018-08-20 | 134.966 | 139.781 | 127.635 |
| 2018-08-21 | 134.613 | 140.834 | 128.478 |
| 2018-08-22 | 133.998 | 140.913 | 128.329 |
| 2018-08-23 | 133.637 | 141.686 | 127.475 |
| 2018-08-24 | 133.857 | 141.109 | 128.404 |
| 2018-08-27 | 134.48 | 141.114 | 130.208 |
| 2018-08-28 | 134.081 | 140.918 | 129.071 |
| 2018-08-29 | 134.888 | 140.522 | 129.685 |
| 2018-08-30 | 134.833 | 140.109 | 127.501 |
| 2018-08-31 | 134.833 | 139.77 | 127.816 |
| 2018-09-03 | 134.955 | 140.035 | 127.651 |
| 2018-09-04 | 134.522 | 140.564 | 126.695 |
| 2018-09-05 | 133.074 | 140.58 | 124.004 |
| 2018-09-06 | 132.727 | 141.379 | 123.946 |
| 2018-09-07 | 133.386 | 141.453 | 124.789 |
| 2018-09-10 | 133.237 | 140.654 | 122.91 |
| 2018-09-11 | 133.419 | 141.421 | 122.312 |
| 2018-09-12 | 133.482 | 141.58 | 123.332 |
| 2018-09-13 | 133.388 | 142.717 | 123.876 |
| 2018-09-14 | 134.075 | 142.617 | 125.008 |
| 2018-09-17 | 133.623 | 142.141 | 123.476 |
| 2018-09-18 | 134.229 | 141.966 | 124.229 |
| 2018-09-19 | 134.544 | 140.913 | 125.793 |
| 2018-09-20 | 134.759 | 141.305 | 125.788 |
| 2018-09-21 | 135.247 | 141.289 | 127.015 |
| 2018-09-24 | 134.171 | 141.813 | 125.158 |
| 2018-09-25 | 134.687 | 141.797 | 125.537 |
| 2018-09-26 | 135.015 | 141.918 | 126.636 |
| 2018-09-27 | 135.765 | 140.754 | 127.736 |
| 2018-09-28 | 135.815 | 139.961 | 127.736 |
| 2018-10-01 | 136.857 | 139.924 | 127.977 |
| 2018-10-02 | 136.339 | 139.744 | 126.658 |
| 2018-10-04 | 135.633 | 135.231 | 123.385 |
| 2018-10-05 | 134.858 | 132.385 | 121.949 |
| 2018-10-08 | 134.37 | 134.173 | 122.162 |
| 2018-10-09 | 134.822 | 133.437 | 122.637 |
| 2018-10-10 | 132.018 | 136.279 | 119.493 |
| 2018-10-11 | 128.084 | 136.326 | 116.935 |
| 2018-10-12 | 128.406 | 134.411 | 119.818 |
| 2018-10-15 | 128.561 | 134.305 | 119.114 |
| 2018-10-16 | 129.829 | 133.75 | 121.068 |
| 2018-10-17 | 130.273 | 132.945 | 120.694 |
| 2018-10-18 | 129.529 | 128.977 | 118.446 |
| 2018-10-19 | 129.926 | 131.289 | 119.557 |
| 2018-10-22 | 129.402 | 128.967 | 120.598 |
| 2018-10-23 | 126.843 | 128.3 | 117.816 |
| 2018-10-24 | 127.29 | 130.263 | 117.704 |
| 2018-10-25 | 127.417 | 131.628 | 118.975 |
| 2018-10-26 | 125.608 | 132.993 | 116.823 |
| 2018-10-29 | 126.529 | 132.168 | 116.396 |
| 2018-10-30 | 126.118 | 132.919 | 116.578 |
| 2018-10-31 | 129.145 | 133.76 | 119.151 |
| 2018-11-01 | 128.996 | 136.585 | 121.725 |
| 2018-11-02 | 128.845 | 136.353 | 123.006 |
| 2018-11-05 | 128.994 | 135.093 | 123.139 |
| 2018-11-06 | 129.446 | 132.485 | 122.84 |
| 2018-11-07 | 130.838 | 132.263 | 123.919 |
| 2018-11-08 | 131.9 | 131.358 | 123.342 |
| 2018-11-09 | 131.456 | 132.718 | 120.929 |
| 2018-11-12 | 130.477 | 133.056 | 120.262 |
| 2018-11-13 | 130.59 | 130.85 | 122.136 |
| 2018-11-14 | 129.046 | 128.443 | 121.228 |
| 2018-11-15 | 128.539 | 128.871 | 123.214 |
| 2018-11-16 | 128.426 | 128.041 | 122.344 |
| 2018-11-19 | 127.24 | 130.046 | 121.65 |
| 2018-11-20 | 125.558 | 130.453 | 120.171 |
| 2018-11-21 | 126.405 | 133.501 | 122.173 |
| 2018-11-22 | 124.993 | 133.226 | 120.801 |
| 2018-11-23 | 126.17 | 134.109 | 121.239 |
| 2018-11-26 | 127.003 | 135.765 | 122.333 |
| 2018-11-27 | 127.863 | 131.554 | 123.251 |
| 2018-11-28 | 128.453 | 131.221 | 124.026 |
| 2018-11-29 | 129.165 | 128.173 | 124.837 |
| 2018-11-30 | 129.686 | 128.327 | 124.511 |
| 2018-12-03 | 131.348 | 128.364 | 126.855 |
| 2018-12-04 | 130.532 | 129.073 | 126.711 |
| 2018-12-05 | 128.31 | 129.03 | 124.997 |
| 2018-12-06 | 124.522 | 126.649 | 120.678 |
| 2018-12-07 | 125.423 | 123.396 | 122.045 |
| 2018-12-10 | 122.746 | 123.348 | 118.446 |
| 2018-12-11 | 125.531 | 121.38 | 120.924 |
| 2018-12-12 | 126.424 | 119.385 | 123.011 |
| 2018-12-13 | 125.754 | 117.01 | 122.91 |
| 2018-12-14 | 125.114 | 113.788 | 122.734 |
| 2018-12-17 | 123.422 | 119.544 | 121.361 |
| 2018-12-18 | 121.889 | 120.655 | 120.641 |
| 2018-12-19 | 121.729 | 120.502 | 120.913 |
| 2018-12-20 | 118.439 | 121.586 | 119.199 |
| 2018-12-21 | 118.191 | 121.681 | 119.519 |
| 2018-12-27 | 116.19 | 118.777 | 118.521 |
| 2018-12-28 | 118.828 | 122.697 | 119.808 |
| 2019-01-02 | 119.661 | 123.618 | 120.635 |
| 2019-01-03 | 118.12 | 124.819 | 118.5 |
| 2019-01-04 | 120.64 | 125.395 | 121.602 |
| 2019-01-07 | 121.486 | 125.919 | 121.201 |
| 2019-01-08 | 121.902 | 125.861 | 121.452 |
| 2019-01-09 | 122.426 | 125.168 | 123.182 |
| 2019-01-10 | 122.917 | 126.634 | 123.823 |
| 2019-01-11 | 123.262 | 126.914 | 124.207 |
| 2019-01-14 | 122.92 | 127.861 | 123.326 |
| 2019-01-15 | 124.323 | 129.58 | 125.056 |
| 2019-01-16 | 125.183 | 127.856 | 126.492 |
| 2019-01-17 | 125.338 | 128.046 | 126.161 |
| 2019-01-18 | 127.679 | 128.173 | 128.131 |
| 2019-01-21 | 127.218 | 129.263 | 127.058 |
| 2019-01-22 | 126.623 | 128.263 | 126.252 |
| 2019-01-23 | 125.699 | 128.104 | 126.183 |
| 2019-01-24 | 126.479 | 130.131 | 128.019 |
| 2019-01-25 | 127.304 | 131.215 | 129.167 |
| 2019-01-28 | 125.624 | 131.326 | 127.272 |
| 2019-01-29 | 126.09 | 132.263 | 127.886 |
| 2019-01-30 | 127.058 | 132.85 | 128.585 |
| 2019-01-31 | 128.197 | 132.686 | 130.966 |
| 2019-02-01 | 128.382 | 131.385 | 130.23 |
| 2019-02-04 | 128.864 | 131.554 | 131.1 |
| 2019-02-05 | 130.276 | 131.623 | 132.483 |
| 2019-02-06 | 130.278 | 133.326 | 131.911 |
| 2019-02-07 | 128.674 | 133.728 | 129.455 |
| 2019-02-08 | 128.558 | 133.432 | 129.226 |
| 2019-02-11 | 129.983 | 134.903 | 130.24 |
| 2019-02-12 | 130.951 | 135.136 | 130.715 |
| 2019-02-13 | 131.765 | 135.448 | 130.251 |
| 2019-02-14 | 131.428 | 134.956 | 129.632 |
| 2019-02-15 | 132.986 | 135.765 | 130.507 |
| 2019-02-18 | 132.931 | 135.966 | 130.342 |
| 2019-02-19 | 132.757 | 135.866 | 130.411 |
| 2019-02-20 | 133.049 | 135.797 | 131.906 |
| 2019-02-21 | 132.975 | 135.48 | 130.881 |
| 2019-02-22 | 133.593 | 136.411 | 132.776 |
| 2019-02-25 | 134.232 | 135.887 | 134.394 |
| 2019-02-26 | 133.83 | 135.728 | 133.348 |
| 2019-02-27 | 133.424 | 134.861 | 132.344 |
| 2019-02-28 | 133.295 | 133.776 | 130.86 |
| 2019-03-01 | 133.427 | 133.506 | 130.779 |
| 2019-03-04 | 134.081 | 135.453 | 131.399 |
| 2019-03-05 | 134.37 | 135.935 | 133.353 |
| 2019-03-06 | 133.769 | 136.86 | 133.006 |
| 2019-03-07 | 133.686 | 136.813 | 131.751 |
| 2019-03-08 | 132.277 | 137.479 | 129.744 |
| 2019-03-11 | 134.105 | 137.972 | 132.397 |
| 2019-03-12 | 134.202 | 138.014 | 132.579 |
| 2019-03-13 | 134.955 | 137.522 | 132.152 |
| 2019-03-14 | 134.996 | 138.315 | 131.703 |
| 2019-03-15 | 135.688 | 135.686 | 133.353 |
| 2019-03-18 | 135.669 | 135.564 | 134.1 |
| 2019-03-19 | 136.413 | 136.543 | 134.714 |
| 2019-03-20 | 134.952 | 135.908 | 133.267 |
| 2019-03-21 | 135.911 | 136.437 | 133.796 |
| 2019-03-22 | 134.891 | 137.315 | 131.965 |
| 2019-03-25 | 134.072 | 138.897 | 131.778 |
| 2019-03-26 | 135.415 | 138.945 | 132.387 |
| 2019-03-27 | 135.148 | 139.204 | 131.741 |
| 2019-03-28 | 135.597 | 139.538 | 132.05 |
| 2019-03-29 | 136.631 | 140.21 | 134.132 |
| 2019-04-01 | 138.153 | 140.331 | 136.108 |
| 2019-04-02 | 138.621 | 139.585 | 136.033 |
| 2019-04-03 | 139.294 | 140.067 | 137.266 |
| 2019-04-04 | 139.018 | 140.04 | 137.288 |
| 2019-04-05 | 139.592 | 140.987 | 138.356 |
| 2019-04-08 | 139.112 | 140.892 | 137.688 |
| 2019-04-09 | 138.572 | 140.993 | 137.592 |
| 2019-04-10 | 138.842 | 140.649 | 138.398 |
| 2019-04-11 | 138.963 | 140.913 | 136.743 |
| 2019-04-12 | 139.035 | 141.051 | 137.427 |
| 2019-04-15 | 139.206 | 142.268 | 136.567 |
| 2019-04-16 | 139.796 | 141.987 | 137.608 |
| 2019-04-17 | 139.371 | 141.934 | 137.896 |
| 2019-04-18 | 140.039 | 142.585 | 138.607 |
| 2019-04-23 | 141.379 | 142.765 | 138.393 |
| 2019-04-24 | 141.538 | 142.855 | 137.368 |
| 2019-04-25 | 141.88 | 141.813 | 137.165 |
| 2019-04-26 | 141.853 | 141.532 | 137.763 |
| 2019-04-29 | 142.321 | 142.876 | 137.678 |
| 2019-04-30 | 141.61 | 142.31 | 136.69 |
| 2019-05-02 | 140.982 | 140.003 | 136.604 |
| 2019-05-03 | 142.002 | 139.728 | 138.275 |
| 2019-05-06 | 140.805 | 139.3 | 135.035 |
| 2019-05-07 | 139.421 | 139.95 | 133.209 |
| 2019-05-08 | 138.958 | 136.517 | 132.979 |
| 2019-05-09 | 136.678 | 137.702 | 128.473 |
| 2019-05-10 | 136.41 | 138.516 | 129.087 |
| 2019-05-13 | 135.305 | 139.786 | 126.14 |
| 2019-05-14 | 137.237 | 138.94 | 128.617 |
| 2019-05-15 | 137.599 | 137.993 | 128.42 |
| 2019-05-16 | 139.575 | 139.162 | 129.237 |
| 2019-05-17 | 139.156 | 138.781 | 126.583 |
| 2019-05-20 | 137.651 | 137.157 | 125.579 |
| 2019-05-21 | 138.61 | 137.395 | 126.813 |
| 2019-05-22 | 138.473 | 136.162 | 126.882 |
| 2019-05-23 | 136.529 | 135.226 | 125.248 |
| 2019-05-24 | 136.738 | 135.601 | 124.714 |
| 2019-05-27 | 137.155 | 133.787 | 125.387 |
| 2019-05-28 | 137.042 | 133.39 | 125.686 |
| 2019-05-29 | 135.307 | 136.326 | 125.878 |
| 2019-05-30 | 135.826 | 137.479 | 127.496 |
| 2019-05-31 | 134.833 | 138.374 | 127.768 |
| 2019-06-03 | 134.056 | 139.755 | 128.398 |
| 2019-06-04 | 134.968 | 140.411 | 127.758 |
| 2019-06-05 | 135.972 | 140.384 | 126.978 |
| 2019-06-06 | 136.261 | 140.12 | 126.45 |
| 2019-06-07 | 137.505 | 140.744 | 127.309 |
| 2019-06-11 | 138.649 | 140.532 | 129.658 |
| 2019-06-12 | 138.076 | 140.659 | 128.548 |
| 2019-06-13 | 138.627 | 142.061 | 128.66 |
| 2019-06-14 | 138.952 | 142.437 | 128.601 |
| 2019-06-17 | 138.98 | 143.765 | 128.356 |
| 2019-06-18 | 141.136 | 143.596 | 131.757 |
| 2019-06-19 | 140.86 | 143.41 | 131.596 |
| 2019-06-20 | 141.406 | 141.992 | 133.748 |
| 2019-06-21 | 141.274 | 141.855 | 133.017 |
| 2019-06-24 | 140.21 | 141.617 | 132.093 |
| 2019-06-25 | 139.735 | 142.4 | 131.522 |
| 2019-06-26 | 139.217 | 143.611 | 132.221 |
| 2019-06-27 | 139.415 | 144.029 | 132.766 |
| 2019-06-28 | 140.088 | 145.135 | 132.691 |
| 2019-07-01 | 142.073 | 144.95 | 135.286 |
| 2019-07-02 | 142.244 | 144.225 | 134.907 |
| 2019-07-03 | 143.711 | 144.405 | 134.693 |
| 2019-07-04 | 144.058 | 145.077 | 135.606 |
| 2019-07-05 | 143.783 | 145.368 | 134.944 |
| 2019-07-08 | 143.474 | 146.082 | 134.202 |
| 2019-07-09 | 143.242 | 146.119 | 133.695 |
| 2019-07-10 | 143.364 | 145.643 | 134.41 |
| 2019-07-11 | 143.661 | 144.659 | 134.148 |
| 2019-07-12 | 143.888 | 145.188 | 134.015 |
| 2019-07-15 | 144.141 | 144.41 | 134.714 |
| 2019-07-16 | 144.599 | 144.76 | 135.467 |
| 2019-07-17 | 143.81 | 145.754 | 134.624 |
| 2019-07-18 | 142.956 | 146.426 | 134.506 |
| 2019-07-19 | 143.981 | 145.712 | 135.211 |
| 2019-07-22 | 143.496 | 146.754 | 134.944 |
| 2019-07-23 | 144.891 | 146.49 | 135.275 |
| 2019-07-24 | 145.503 | 146.135 | 135.681 |
| 2019-07-25 | 145.117 | 144.479 | 134.565 |
| 2019-07-26 | 146.055 | 143.268 | 134.949 |
| 2019-07-29 | 145.729 | 142.22 | 134.293 |
| 2019-07-30 | 144.886 | 138.024 | 133.518 |
| 2019-07-31 | 145.145 | 139.802 | 133.438 |
| 2019-08-01 | 146.022 | 139.897 | 133.924 |
| 2019-08-02 | 141.307 | 142.627 | 128.388 |
| 2019-08-05 | 137.855 | 141.633 | 123.337 |
| 2019-08-06 | 136.865 | 139.971 | 123.716 |
| 2019-08-07 | 137.097 | 142.141 | 123.412 |
| 2019-08-08 | 140.083 | 137.86 | 126.108 |
| 2019-08-09 | 139.217 | 138.294 | 124.933 |
| 2019-08-12 | 138.406 | 140.321 | 123.492 |
| 2019-08-13 | 140.061 | 142.045 | 125.478 |
| 2019-08-14 | 137.888 | 140.945 | 123.123 |
| 2019-08-15 | 137.612 | 142.088 | 123.465 |
| 2019-08-16 | 139.636 | 142.035 | 125.344 |
| 2019-08-19 | 141.29 | 138.39 | 126.359 |
| 2019-08-20 | 140.849 | 139.924 | 126.375 |
| 2019-08-21 | 141.522 | 139.374 | 127.128 |
| 2019-08-22 | 141.059 | 140.342 | 125.884 |
| 2019-08-23 | 138.842 | 142.167 | 123.983 |
| 2019-08-26 | 139.134 | 142.109 | 124.442 |
| 2019-08-27 | 139.807 | 141.321 | 125.158 |
| 2019-08-28 | 139.895 | 142.834 | 125.174 |
| 2019-08-29 | 141.869 | 144.723 | 126.53 |
| 2019-08-30 | 142.752 | 144.828 | 128.105 |
| 2019-09-02 | 142.862 | 144.865 | 128.318 |
| 2019-09-03 | 142.531 | 144.897 | 128.062 |
| 2019-09-04 | 143.226 | 145.939 | 129.354 |
| 2019-09-05 | 144.979 | 146.368 | 130.828 |
| 2019-09-06 | 145.244 | 146.331 | 131.5 |
| 2019-09-09 | 145.161 | 145.849 | 131.682 |
| 2019-09-10 | 144.472 | 146.246 | 131.159 |
| 2019-09-11 | 146.435 | 146.336 | 133.049 |
| 2019-09-12 | 146.744 | 146.304 | 133.556 |
| 2019-09-13 | 146.827 | 145.521 | 133.972 |
| 2019-09-16 | 146.832 | 145.622 | 134.271 |
| 2019-09-17 | 146.369 | 144.416 | 132.846 |
| 2019-09-18 | 146.126 | 145.299 | 132.504 |
| 2019-09-19 | 147.411 | 144.326 | 133.017 |
| 2019-09-20 | 147.521 | 143.516 | 133.545 |
| 2019-09-23 | 146.849 | 144.225 | 133.166 |
| 2019-09-24 | 146.656 | 142.49 | 132.109 |
| 2019-09-25 | 146.325 | 139.977 | 131.906 |
| 2019-09-26 | 146.749 | 141.088 | 132.328 |
| 2019-09-27 | 147.097 | 143.045 | 132.499 |
| 2019-09-30 | 147.361 | 142.432 | 132.322 |
| 2019-10-01 | 146.06 | 140.22 | 130.982 |
| 2019-10-02 | 142.106 | 141.527 | 128.97 |
| 2019-10-04 | 144.13 | 142.49 | 130.646 |
| 2019-10-07 | 144.786 | 143.977 | 130.539 |
| 2019-10-08 | 142.917 | 143.844 | 129.765 |
| 2019-10-09 | 143.292 | 145.236 | 130.203 |
| 2019-10-10 | 144.334 | 145.008 | 131.345 |
| 2019-10-11 | 146.441 | 145.4 | 133.524 |
| 2019-10-14 | 145.702 | 144.802 | 132.696 |
| 2019-10-15 | 146.871 | 145.812 | 133.198 |
| 2019-10-16 | 146.314 | 145.299 | 133.316 |
| 2019-10-17 | 145.851 | 145.728 | 133.444 |
| 2019-10-18 | 145.277 | 145.966 | 132.814 |
| 2019-10-21 | 146.066 | 146.574 | 133.027 |
| 2019-10-22 | 146.402 | 147.426 | 133.983 |
| 2019-10-23 | 146.407 | 147.331 | 133.844 |
| 2019-10-24 | 147.251 | 147.849 | 134.842 |
| 2019-10-25 | 147.852 | 147.373 | 135.392 |
| 2019-10-28 | 148.332 | 148.775 | 136.327 |
| 2019-10-29 | 148.326 | 149.368 | 135.505 |
| 2019-10-30 | 147.902 | 149.177 | 135.024 |
| 2019-10-31 | 147.229 | 149.257 | 134.095 |
| 2019-11-01 | 148.519 | 149.786 | 135.99 |
| 2019-11-04 | 149.926 | 150.151 | 138.03 |
| 2019-11-05 | 150.664 | 149.86 | 139.461 |
| 2019-11-06 | 150.631 | 150.156 | 139.6 |
| 2019-11-07 | 151.872 | 150.22 | 140.593 |
| 2019-11-08 | 151.585 | 150.421 | 139.696 |
| 2019-11-11 | 151.315 | 151.542 | 138.195 |
| 2019-11-12 | 152.341 | 151.637 | 138.201 |
| 2019-11-13 | 151.966 | 151.563 | 136.839 |
| 2019-11-14 | 151.624 | 151.029 | 136.626 |
| 2019-11-15 | 152.335 | 150.796 | 137.8 |
| 2019-11-18 | 152.192 | 151.13 | 137.245 |
| 2019-11-19 | 152.109 | 152.278 | 137.048 |
| 2019-11-20 | 151.955 | 152.585 | 137.186 |
| 2019-11-21 | 151.238 | 153.304 | 135.985 |
| 2019-11-22 | 151.966 | 152.717 | 136.7 |
| 2019-11-25 | 153.532 | 151.473 | 138.35 |
| 2019-11-26 | 153.736 | 150.41 | 137.416 |
| 2019-11-27 | 154.42 | 151.373 | 138.014 |
| 2019-11-28 | 154.353 | 151.653 | 137.838 |
| 2019-11-29 | 153.708 | 153.002 | 136.321 |
| 2019-12-02 | 151.199 | 152.537 | 135.104 |
| 2019-12-03 | 149.948 | 152.394 | 133.871 |
| 2019-12-04 | 151.74 | 152.791 | 135.665 |
| 2019-12-05 | 151.271 | 154.135 | 135.804 |
| 2019-12-06 | 153.83 | 154.193 | 137.245 |
| 2019-12-09 | 153.229 | 155.283 | 137.021 |
| 2019-12-10 | 152.589 | 155.315 | 136.791 |
| 2019-12-11 | 152.71 | 155.325 | 137.993 |
| 2019-12-12 | 153.433 | 155.971 | 140.128 |
| 2019-12-13 | 153.741 | 156.764 | 140.432 |
| 2019-12-16 | 155.247 | 156.161 | 141.938 |
| 2019-12-17 | 154.784 | 156.161 | 142.477 |
| 2019-12-18 | 155.192 | 156.96 | 143.406 |
| 2019-12-19 | 155.379 | 156.96 | 143.727 |
| 2019-12-20 | 156.879 | 156.098 | 144.72 |
| 2019-12-23 | 156.714 | 156.5 | 144.501 |
| 2019-12-27 | 156.504 | 157.886 | 145.158 |
| 2019-12-30 | 156.074 | 156.732 | 144.976 |
| 2020-01-02 | 156.328 | 157.32 | 146.14 |
| 2020-01-03 | 156.272 | 156.886 | 145.398 |
| 2020-01-06 | 155.914 | 157.695 | 143.967 |
| 2020-01-07 | 156.884 | 158.785 | 144.576 |
| 2020-01-08 | 157.53 | 158.33 | 145.088 |
| 2020-01-09 | 158.522 | 159.378 | 146.813 |
| 2020-01-10 | 158.362 | 159.166 | 147.405 |
| 2020-01-13 | 158.175 | 159.521 | 148.516 |
| 2020-01-14 | 158.853 | 160.854 | 148.211 |
| 2020-01-15 | 158.792 | 161.399 | 147.427 |
| 2020-01-16 | 159.487 | 161.066 | 148.324 |
| 2020-01-17 | 160.755 | 161.108 | 149.279 |
| 2020-01-20 | 160.97 | 161.267 | 149.253 |
| 2020-01-21 | 160.711 | 159.796 | 146.861 |
| 2020-01-22 | 161.004 | 157.256 | 147.624 |
| 2020-01-23 | 160.48 | 158.96 | 145.483 |
| 2020-01-24 | 161.208 | 158.801 | 146.428 |
| 2020-01-27 | 158.042 | 159.298 | 140.956 |
| 2020-01-28 | 159.393 | 156.441 | 142.338 |
| 2020-01-29 | 159.934 | 157.579 | 143.097 |
| 2020-01-30 | 158.114 | 160.007 | 139.578 |
| 2020-01-31 | 156.471 | 161.817 | 136.919 |
| 2020-02-03 | 157.232 | 162.367 | 138.772 |
| 2020-02-04 | 160.154 | 161.542 | 143.38 |
| 2020-02-05 | 161.505 | 162.7 | 144.058 |
| 2020-02-06 | 162.685 | 162.997 | 144.912 |
| 2020-02-07 | 162.663 | 164.044 | 143.182 |
| 2020-02-10 | 163.165 | 163.886 | 143.812 |
| 2020-02-11 | 164.312 | 164.161 | 145.82 |
| 2020-02-12 | 165.261 | 163.711 | 147.726 |
| 2020-02-13 | 165.895 | 164.499 | 147.266 |
| 2020-02-14 | 165.867 | 163.854 | 147.208 |
| 2020-02-17 | 166.281 | 162.155 | 148.131 |
| 2020-02-18 | 165.365 | 156.732 | 146.183 |
| 2020-02-19 | 166.948 | 152.024 | 147.806 |
| 2020-02-20 | 165.139 | 151.352 | 145.083 |
| 2020-02-21 | 164.086 | 144.643 | 144.362 |
| 2020-02-24 | 158.544 | 143.77 | 138.537 |
| 2020-02-25 | 155.842 | 150.188 | 138.318 |
| 2020-02-26 | 155.318 | 146.045 | 139.263 |
| 2020-02-27 | 148.685 | 152.098 | 134.309 |
| 2020-02-28 | 142.575 | 147.003 | 130.278 |
| 2020-03-02 | 144.577 | 144.537 | 131.58 |
| 2020-03-03 | 145.757 | 133.384 | 133.769 |
| 2020-03-04 | 147.124 | 139.575 | 134.624 |
| 2020-03-05 | 146.187 | 132.654 | 133.374 |
| 2020-03-06 | 139.873 | 119.824 | 127.432 |
| 2020-03-09 | 130.135 | 131.02 | 117.811 |
| 2020-03-10 | 129.76 | 115.639 | 120.902 |
| 2020-03-11 | 130.339 | 123.21 | 120.555 |
| 2020-03-12 | 117.767 | 116.475 | 106.255 |
| 2020-03-13 | 120.466 | 116.576 | 113.203 |
| 2020-03-16 | 116.962 | 111.497 | 105.326 |
| 2020-03-17 | 118.638 | 108.074 | 108.382 |
| 2020-03-18 | 114.083 | 118.38 | 102.405 |
| 2020-03-19 | 117.276 | 119.898 | 102.309 |
| 2020-03-20 | 117.287 | 127.104 | 106.62 |
| 2020-03-23 | 110.8 | 123.2 | 100.75 |
| 2020-03-24 | 119.906 | 127.184 | 108.302 |
| 2020-03-25 | 123.256 | 125.295 | 110.918 |
| 2020-03-26 | 125.613 | 119.65 | 113.075 |
| 2020-03-27 | 122.572 | 122.449 | 107.245 |
| 2020-03-30 | 124.924 | 120.639 | 108.639 |
| 2020-03-31 | 127.127 | 128.845 | 111.575 |
| 2020-04-01 | 121.996 | 128.914 | 107.72 |
| 2020-04-02 | 122.854 | 133.289 | 110.545 |
| 2020-04-03 | 122.288 | 135.268 | 109.525 |
| 2020-04-06 | 127.615 | 133.956 | 114.453 |
| 2020-04-07 | 131.751 | 138.046 | 116.487 |
| 2020-04-08 | 131.483 | 135.04 | 115.953 |
| 2020-04-09 | 134.136 | 135.723 | 117.021 |
| 2020-04-14 | 135.114 | 139.469 | 117.779 |
| 2020-04-15 | 132.878 | 136.956 | 115.211 |
| 2020-04-16 | 134.353 | 132.771 | 117.293 |
| 2020-04-17 | 136.245 | 135.691 | 118.083 |
| 2020-04-20 | 137.593 | 135.665 | 118.751 |
| 2020-04-21 | 131.811 | 137.633 | 114.458 |
| 2020-04-22 | 134.795 | 139.622 | 118.067 |
| 2020-04-23 | 136.612 | 138.977 | 119.146 |
| 2020-04-24 | 135.506 | 142.559 | 117.154 |
| 2020-04-27 | 138.5 | 141.315 | 119.21 |
| 2020-04-28 | 139.537 | 137.464 | 120.609 |
| 2020-04-29 | 141.77 | 137.897 | 122.509 |
| 2020-04-30 | 139.388 | 139.167 | 120.918 |
| 2020-05-04 | 135.142 | 138.231 | 116.492 |
| 2020-05-05 | 139.222 | 139.866 | 119.359 |
| 2020-05-06 | 138.655 | 142.204 | 118.836 |
| 2020-05-07 | 140.204 | 142.225 | 119.605 |
| 2020-05-08 | 140.91 | 139.363 | 121.559 |
| 2020-05-11 | 141.406 | 136.892 | 121.319 |
| 2020-05-12 | 141.097 | 138.543 | 122.029 |
| 2020-05-13 | 137.805 | 139.167 | 120.785 |
| 2020-05-14 | 136.283 | 143.421 | 119.37 |
| 2020-05-15 | 137.08 | 142.067 | 118.82 |
| 2020-05-18 | 142.051 | 144.384 | 122.451 |
| 2020-05-19 | 141.544 | 143.347 | 122.653 |
| 2020-05-20 | 142.101 | 143.67 | 123.145 |
| 2020-05-21 | 140.827 | 145.516 | 121.351 |
| 2020-05-22 | 140.998 | 147.638 | 119.968 |
| 2020-05-25 | 143.788 | 147.347 | 121.837 |
| 2020-05-26 | 143.871 | 148.008 | 122.483 |
| 2020-05-27 | 143.457 | 148.654 | 121.447 |
| 2020-05-28 | 145.613 | 149.876 | 121.308 |
| 2020-05-29 | 142.862 | 151.854 | 119.877 |
| 2020-06-02 | 145.261 | 151.468 | 125.996 |
| 2020-06-03 | 147.543 | 155.341 | 128.815 |
| 2020-06-04 | 146.099 | 157.224 | 126.327 |
| 2020-06-05 | 150.141 | 156.108 | 130.149 |
| 2020-06-08 | 150.262 | 155.135 | 129.194 |
| 2020-06-09 | 149.148 | 146.193 | 128.34 |
| 2020-06-10 | 148.812 | 147.955 | 128.889 |
| 2020-06-11 | 143.176 | 149.304 | 124.997 |
| 2020-06-12 | 143.413 | 152.225 | 126.434 |
| 2020-06-15 | 142.156 | 151.526 | 124.202 |
| 2020-06-16 | 146.816 | 151.664 | 126.909 |
| 2020-06-17 | 147.747 | 150.77 | 128.131 |
| 2020-06-18 | 147.069 | 151.77 | 128.468 |
| 2020-06-19 | 148.249 | 152.458 | 129.616 |
| 2020-06-22 | 146.385 | 148.558 | 129.242 |
| 2020-06-23 | 147.725 | 150.13 | 130.288 |
| 2020-06-24 | 143.899 | 146.611 | 128.5 |
| 2020-06-25 | 144.505 | 147.982 | 129.05 |
| 2020-06-26 | 144.014 | 149.955 | 128.457 |
| 2020-06-29 | 144.207 | 150.981 | 128.211 |
| 2020-06-30 | 145.294 | 151.743 | 128.324 |
| 2020-07-01 | 146.187 | 154.098 | 129.13 |
| 2020-07-02 | 148.464 | 152.5 | 132.605 |
| 2020-07-03 | 147.466 | 153.632 | 133.518 |
| 2020-07-06 | 149.501 | 152.849 | 137.288 |
| 2020-07-07 | 149.269 | 154.383 | 136.353 |
| 2020-07-08 | 147.599 | 152.987 | 136.829 |
| 2020-07-09 | 147.075 | 155.034 | 137.758 |
| 2020-07-10 | 148.448 | 156.41 | 137.181 |
| 2020-07-13 | 150.742 | 155.955 | 138.729 |
| 2020-07-14 | 147.979 | 156.367 | 135.296 |
| 2020-07-15 | 149.892 | 157.669 | 135.846 |
| 2020-07-16 | 149.22 | 157.997 | 133.908 |
| 2020-07-17 | 149.606 | 158.896 | 134.682 |
| 2020-07-20 | 150.389 | 156.997 | 136.065 |
| 2020-07-21 | 151.398 | 155.981 | 137.736 |
| 2020-07-22 | 149.611 | 157.119 | 135.44 |
| 2020-07-23 | 149.964 | 156.145 | 135.43 |
| 2020-07-24 | 147.191 | 158.034 | 133.284 |
| 2020-07-27 | 146.038 | 157.457 | 133.47 |
| 2020-07-28 | 147.157 | 158.775 | 134.17 |
| 2020-07-29 | 146.871 | 159.775 | 134.661 |
| 2020-07-30 | 145.498 | 160.447 | 132.84 |
| 2020-07-31 | 144.836 | 161.446 | 132.296 |
| 2020-08-03 | 148.144 | 162.531 | 134.234 |
| 2020-08-04 | 148.156 | 162.616 | 134.885 |
| 2020-08-05 | 147.951 | 163.134 | 136.119 |
| 2020-08-06 | 147.963 | 161.817 | 135.707 |
| 2020-08-07 | 149.313 | 164.034 | 135.243 |
| 2020-08-10 | 149.76 | 163.753 | 134.8 |
| 2020-08-11 | 151.194 | 163.753 | 136.028 |
| 2020-08-12 | 151.685 | 164.282 | 136.572 |
| 2020-08-13 | 151.26 | 164.626 | 135.691 |
| 2020-08-14 | 150.714 | 163.928 | 135.467 |
| 2020-08-17 | 150.841 | 164.446 | 136.279 |
| 2020-08-18 | 150.427 | 165.034 | 135.184 |
| 2020-08-19 | 151.188 | 166.711 | 135.51 |
| 2020-08-20 | 150.56 | 167.293 | 133.284 |
| 2020-08-21 | 151.574 | 169.002 | 135.718 |
| 2020-08-24 | 152.837 | 169.34 | 136.845 |
| 2020-08-25 | 152.865 | 170.441 | 137.811 |
| 2020-08-26 | 154.116 | 169.843 | 138.542 |
| 2020-08-27 | 155.219 | 171.43 | 137.977 |
| 2020-08-28 | 153.984 | 173.927 | 137.982 |
| 2020-08-31 | 153.471 | 167.906 | 134.581 |
| 2020-09-01 | 153.978 | 166.563 | 136.834 |
| 2020-09-02 | 156.521 | 161.986 | 137.645 |
| 2020-09-03 | 153.653 | 165.182 | 135.515 |
| 2020-09-04 | 150.477 | 162.293 | 134.885 |
| 2020-09-07 | 152.677 | 162.415 | 135.761 |
| 2020-09-08 | 150.074 | 164.526 | 134.672 |
| 2020-09-09 | 151.784 | 165.372 | 135.515 |
| 2020-09-10 | 151.089 | 164.706 | 134.624 |
| 2020-09-11 | 149.92 | 163.266 | 135.019 |
| 2020-09-14 | 151.288 | 161.367 | 136.311 |
| 2020-09-15 | 152.611 | 159.616 | 138.34 |
| 2020-09-16 | 153.168 | 161.23 | 138.847 |
| 2020-09-17 | 151.012 | 157.494 | 137.496 |
| 2020-09-18 | 149.793 | 157.928 | 136.978 |
| 2020-09-21 | 146.738 | 160.457 | 134.608 |
| 2020-09-22 | 148.387 | 163.145 | 134.704 |
| 2020-09-23 | 149.551 | 161.526 | 134.677 |
| 2020-09-24 | 147.747 | 162.769 | 133.171 |
| 2020-09-25 | 148.883 | 163.801 | 132.862 |
| 2020-09-28 | 151.861 | 162.277 | 134.709 |
| 2020-09-29 | 150.681 | 165.113 | 133.978 |
| 2020-09-30 | 151.552 | 162.806 | 136.108 |
| 2020-10-01 | 151.833 | 165.6 | 136.951 |
| 2020-10-02 | 151.315 | 167.065 | 136.69 |
| 2020-10-05 | 152.302 | 168.552 | 136.642 |
| 2020-10-06 | 152.738 | 171.271 | 138.003 |
| 2020-10-07 | 153.036 | 170.176 | 139.156 |
| 2020-10-08 | 154.398 | 169.113 | 139.573 |
| 2020-10-09 | 154.921 | 168.912 | 140.619 |
| 2020-10-12 | 156.989 | 168.769 | 141.634 |
| 2020-10-13 | 157.546 | 166.219 | 141.676 |
| 2020-10-14 | 156.918 | 166.875 | 141.783 |
| 2020-10-15 | 155.197 | 166.573 | 139.963 |
| 2020-10-16 | 156.686 | 167.488 | 140.763 |
| 2020-10-19 | 155.236 | 168.06 | 140.406 |
| 2020-10-20 | 153.51 | 164.965 | 140.448 |
| 2020-10-21 | 152.826 | 164.42 | 140.865 |
| 2020-10-22 | 152.793 | 158.759 | 140.747 |
| 2020-10-23 | 153.344 | 160.431 | 140.694 |
| 2020-10-26 | 150.951 | 158.627 | 139.792 |
| 2020-10-27 | 150.951 | 160.473 | 140.379 |
| 2020-10-28 | 147.632 | 163.304 | 138.313 |
| 2020-10-29 | 148.707 | 166.981 | 139.786 |
| 2020-10-30 | 147.395 | 170.25 | 138.393 |
| 2020-11-02 | 149.633 | 170.229 | 140.08 |
| 2020-11-03 | 152.17 | 172.351 | 140.176 |
| 2020-11-04 | 155.5 | 172.128 | 144.661 |
| 2020-11-05 | 156.587 | 173.34 | 145.478 |
| 2020-11-06 | 155.743 | 171.737 | 145.323 |
| 2020-11-09 | 161.279 | 174.07 | 149.365 |
| 2020-11-10 | 159.057 | 176.181 | 146.434 |
| 2020-11-11 | 161.263 | 175.303 | 147.33 |
| 2020-11-12 | 159.912 | 173.176 | 147.662 |
| 2020-11-13 | 159.835 | 173.901 | 147.352 |
| 2020-11-16 | 162.277 | 172.737 | 149.92 |
| 2020-11-17 | 161.726 | 173.758 | 149.034 |
| 2020-11-18 | 162.151 | 176.573 | 149.557 |
| 2020-11-19 | 160.618 | 176.282 | 149.162 |
| 2020-11-20 | 161.384 | 176.784 | 150.139 |
| 2020-11-23 | 161.252 | 175.991 | 150.998 |
| 2020-11-24 | 163.496 | 177.927 | 151.869 |
| 2020-11-25 | 163.071 | 178.303 | 151.095 |
| 2020-11-26 | 163.237 | 178.25 | 151.901 |
| 2020-11-27 | 163.292 | 179.784 | 152.232 |
| 2020-11-30 | 161.533 | 179.451 | 148.889 |
| 2020-12-01 | 163.088 | 179.969 | 150.368 |
| 2020-12-02 | 162.206 | 178.372 | 150.011 |
| 2020-12-03 | 162.222 | 178.287 | 151.26 |
| 2020-12-04 | 163.204 | 178.059 | 152.29 |
| 2020-12-07 | 163.127 | 177.245 | 152.856 |
| 2020-12-08 | 163.661 | 179.694 | 152.84 |
| 2020-12-09 | 164.053 | 179.969 | 152.947 |
| 2020-12-10 | 163.038 | 180.948 | 153.193 |
| 2020-12-11 | 161.93 | 180.223 | 152.718 |
| 2020-12-14 | 162.878 | 179.668 | 152.013 |
| 2020-12-15 | 162.641 | 178.583 | 152.184 |
| 2020-12-16 | 163.805 | 178.726 | 153.262 |
| 2020-12-17 | 163.816 | 179.44 | 153.369 |
| 2020-12-18 | 163.358 | 181.001 | 153.604 |
| 2020-12-21 | 161.417 | 180.62 | 151.484 |
| 2020-12-22 | 162.994 | 180.863 | 150.769 |
| 2020-12-23 | 163.799 | 181.837 | 152.306 |
| 2020-12-28 | 164.775 | 179.371 | 152.189 |
| 2020-12-29 | 164.93 | 180.551 | 153.593 |
| 2020-12-30 | 164.632 | 181.646 | 155.227 |
| 2021-01-04 | 163.424 | 184.361 | 157.085 |
| 2021-01-05 | 163.805 | 185.398 | 158.793 |
| 2021-01-06 | 166.082 | 184.186 | 159.237 |
| 2021-01-07 | 167.549 | 184.202 | 159.413 |
| 2021-01-08 | 168.481 | 184.662 | 163.743 |
| 2021-01-11 | 169.104 | 184.038 | 163.721 |
| 2021-01-12 | 168.961 | 182.726 | 164.917 |
| 2021-01-13 | 169.396 | 184.17 | 164.645 |
| 2021-01-14 | 170.289 | 186.673 | 167.763 |
| 2021-01-15 | 168.795 | 186.847 | 165.91 |
| 2021-01-18 | 169.159 | 186.181 | 166.332 |
| 2021-01-19 | 168.977 | 186.937 | 167.363 |
| 2021-01-20 | 171.166 | 186.657 | 169.936 |
| 2021-01-21 | 171.078 | 182.128 | 170.069 |
| 2021-01-22 | 169.904 | 183.657 | 167.891 |
| 2021-01-25 | 169.694 | 179.98 | 169.253 |
| 2021-01-26 | 170.477 | 182.937 | 168.046 |
| 2021-01-27 | 168.404 | 185.567 | 165.921 |
| 2021-01-28 | 168.773 | 185.752 | 165.334 |
| 2021-01-29 | 165.332 | 187.831 | 162.018 |
| 2021-02-01 | 167.494 | 188.583 | 165.585 |
| 2021-02-02 | 171.095 | 189.974 | 169.616 |
| 2021-02-03 | 171.155 | 189.821 | 170.566 |
| 2021-02-04 | 172.826 | 189.747 | 170.481 |
| 2021-02-05 | 173.366 | 190.053 | 171.543 |
| 2021-02-08 | 174.023 | 191.022 | 171.879 |
| 2021-02-09 | 173.967 | 190.842 | 172.499 |
| 2021-02-10 | 173.339 | 190.884 | 173.198 |
| 2021-02-11 | 174.127 | 190.069 | 175.745 |
| 2021-02-12 | 174.728 | 189.72 | 175.659 |
| 2021-02-15 | 176.212 | 188.228 | 177.213 |
| 2021-02-16 | 175.837 | 188.466 | 176.423 |
| 2021-02-17 | 175.026 | 190.551 | 176.305 |
| 2021-02-18 | 174.133 | 185.98 | 173.262 |
| 2021-02-19 | 174.789 | 184.958 | 175.382 |
| 2021-02-22 | 173.096 | 189.471 | 170.667 |
| 2021-02-23 | 171.817 | 188.006 | 169.327 |
| 2021-02-24 | 173.295 | 185.525 | 168.617 |
| 2021-02-25 | 171.685 | 183.239 | 167.544 |
| 2021-02-26 | 170.631 | 186.599 | 164.634 |
| 2021-03-01 | 173.841 | 185.683 | 169.471 |
| 2021-03-02 | 172.809 | 188.281 | 166.813 |
| 2021-03-03 | 172.319 | 189.445 | 168.009 |
| 2021-03-04 | 171.216 | 191.445 | 167.074 |
| 2021-03-05 | 169.479 | 191.715 | 164.704 |
| 2021-03-08 | 174.679 | 192.826 | 164.154 |
| 2021-03-09 | 175.445 | 192.609 | 166.001 |
| 2021-03-10 | 175.975 | 193.238 | 165.083 |
| 2021-03-11 | 177.05 | 190.397 | 169.199 |
| 2021-03-12 | 176.377 | 190.059 | 166.524 |
| 2021-03-15 | 177.364 | 191.561 | 166.909 |
| 2021-03-16 | 179.052 | 190.154 | 168.954 |
| 2021-03-17 | 177.921 | 189.101 | 166.861 |
| 2021-03-18 | 178.478 | 190.165 | 167.245 |
| 2021-03-19 | 177.166 | 192.588 | 167.368 |
| 2021-03-22 | 177.574 | 192.471 | 166.978 |
| 2021-03-23 | 178.015 | 191.979 | 165.937 |
| 2021-03-24 | 177.866 | 192.741 | 163.364 |
| 2021-03-25 | 177.254 | 194.783 | 163.284 |